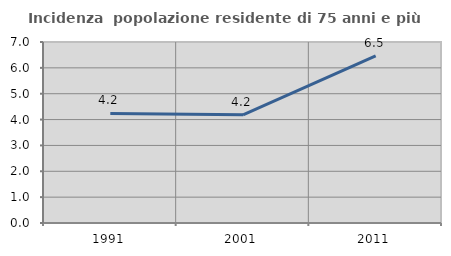
| Category | Incidenza  popolazione residente di 75 anni e più |
|---|---|
| 1991.0 | 4.238 |
| 2001.0 | 4.182 |
| 2011.0 | 6.464 |